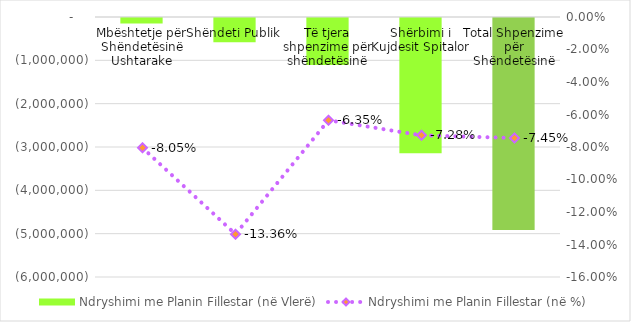
| Category | Ndryshimi me Planin Fillestar (në Vlerë) |
|---|---|
| Mbështetje për Shëndetësinë Ushtarake | -129500 |
| Shëndeti Publik | -559700 |
| Të tjera shpenzime për shëndetësinë | -1085158 |
| Shërbimi i Kujdesit Spitalor | -3120600 |
| Total Shpenzime për Shëndetësinë | -4894958 |